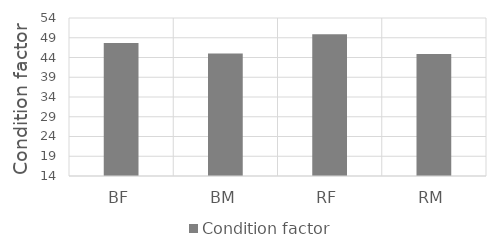
| Category | Condition factor |
|---|---|
| BF | 47.7 |
| BM | 45 |
| RF | 49.9 |
| RM | 44.9 |